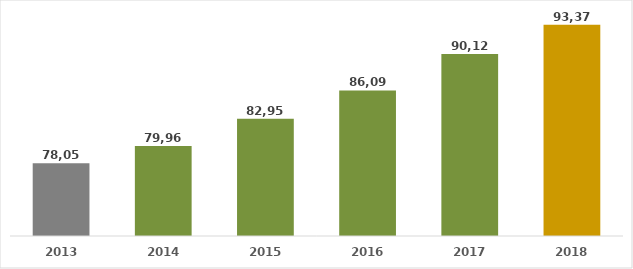
| Category | Series 0 |
|---|---|
| 2013.0 | 78051 |
| 2014.0 | 79961 |
| 2015.0 | 82957 |
| 2016.0 | 86097 |
| 2017.0 | 90125 |
| 2018.0 | 93370 |